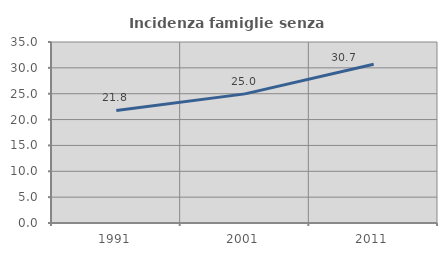
| Category | Incidenza famiglie senza nuclei |
|---|---|
| 1991.0 | 21.775 |
| 2001.0 | 24.97 |
| 2011.0 | 30.694 |